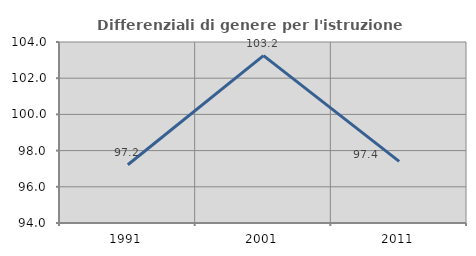
| Category | Differenziali di genere per l'istruzione superiore |
|---|---|
| 1991.0 | 97.217 |
| 2001.0 | 103.245 |
| 2011.0 | 97.405 |